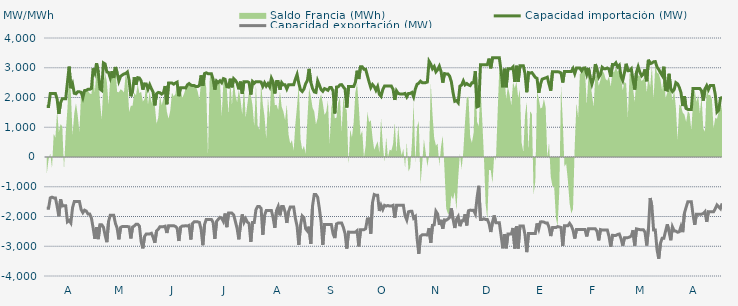
| Category | Capacidad importación (MW) | Capacidad exportación (MW) |
|---|---|---|
| 0 | 1700 | -1725 |
| 1900-01-01 | 1700 | -1725 |
| 1900-01-02 | 2133.333 | -1375 |
| 1900-01-03 | 2133.333 | -1350 |
| 1900-01-04 | 2133.333 | -1375 |
| 1900-01-05 | 2133.333 | -1375 |
| 1900-01-06 | 1943.75 | -1662.5 |
| 1900-01-07 | 1447.917 | -1991.667 |
| 1900-01-08 | 1820.833 | -1420.833 |
| 1900-01-09 | 1958.333 | -1645.833 |
| 1900-01-10 | 1958.333 | -1637.5 |
| 1900-01-11 | 1958.333 | -1637.5 |
| 1900-01-12 | 2502.083 | -2177.083 |
| 1900-01-13 | 3037.5 | -2129.167 |
| 1900-01-14 | 2312.5 | -2216.667 |
| 1900-01-15 | 2456.25 | -1702.083 |
| 1900-01-16 | 2141.667 | -1497.917 |
| 1900-01-17 | 2125 | -1497.917 |
| 1900-01-18 | 2191.667 | -1497.917 |
| 1900-01-19 | 2191.667 | -1497.917 |
| 1900-01-20 | 2175 | -1766.667 |
| 1900-01-21 | 1997.917 | -1870.833 |
| 1900-01-22 | 2233.333 | -1787.5 |
| 1900-01-23 | 2241.667 | -1818.75 |
| 1900-01-24 | 2275 | -1914.583 |
| 1900-01-25 | 2275 | -1914.583 |
| 1900-01-26 | 2304.167 | -2052.083 |
| 1900-01-27 | 2979.167 | -2385.417 |
| 1900-01-28 | 2825 | -2752.083 |
| 1900-01-29 | 3154.167 | -2358.333 |
| 1900-01-30 | 2850 | -2760.417 |
| 1900-01-31 | 2285.417 | -2275 |
| 1900-02-01 | 2239.583 | -2275 |
| 1900-02-02 | 3162.5 | -2358.333 |
| 1900-02-03 | 3127.083 | -2631.25 |
| 1900-02-04 | 2858.333 | -2862.5 |
| 1900-02-05 | 2841.667 | -2166.667 |
| 1900-02-06 | 2656.25 | -1956.25 |
| 1900-02-07 | 2883.333 | -1956.25 |
| 1900-02-08 | 2656.25 | -1956.25 |
| 1900-02-09 | 3025 | -2229.167 |
| 1900-02-10 | 2831.25 | -2393.75 |
| 1900-02-11 | 2550.625 | -2766.667 |
| 1900-02-12 | 2710.417 | -2368.75 |
| 1900-02-13 | 2754.167 | -2337.5 |
| 1900-02-14 | 2791.667 | -2337.5 |
| 1900-02-15 | 2808.333 | -2337.5 |
| 1900-02-16 | 2858.333 | -2337.5 |
| 1900-02-17 | 2581.25 | -2347.917 |
| 1900-02-18 | 2041.667 | -2737.5 |
| 1900-02-19 | 2218.75 | -2354.167 |
| 1900-02-20 | 2679.167 | -2320.833 |
| 1900-02-21 | 2427.083 | -2260.417 |
| 1900-02-22 | 2666.667 | -2260.417 |
| 1900-02-23 | 2654.167 | -2320.833 |
| 1900-02-24 | 2562.5 | -2837.5 |
| 1900-02-25 | 2264.583 | -3070.833 |
| 1900-02-26 | 2458.333 | -2672.917 |
| 1900-02-27 | 2454.167 | -2585.417 |
| 1900-02-28 | 2279.167 | -2585.417 |
| 1900-02-28 | 2431.25 | -2585.417 |
| 1900-03-01 | 2295.833 | -2562.5 |
| 1900-03-02 | 2181.25 | -2700 |
| 1900-03-03 | 1735.417 | -2883.333 |
| 1900-03-04 | 2125 | -2487.5 |
| 1900-03-05 | 2170.833 | -2429.167 |
| 1900-03-06 | 2158.333 | -2341.667 |
| 1900-03-07 | 2112.5 | -2341.667 |
| 1900-03-08 | 2158.333 | -2341.667 |
| 1900-03-09 | 2383.333 | -2325 |
| 1900-03-10 | 1772.917 | -2554.167 |
| 1900-03-11 | 2485.417 | -2308.333 |
| 1900-03-12 | 2485.417 | -2308.333 |
| 1900-03-13 | 2485.417 | -2308.333 |
| 1900-03-14 | 2447.917 | -2308.333 |
| 1900-03-15 | 2485.417 | -2333.333 |
| 1900-03-16 | 2516.667 | -2387.5 |
| 1900-03-17 | 2043.75 | -2822.917 |
| 1900-03-18 | 2331.25 | -2362.5 |
| 1900-03-19 | 2331.25 | -2320.833 |
| 1900-03-20 | 2331.25 | -2320.833 |
| 1900-03-21 | 2318.75 | -2308.333 |
| 1900-03-22 | 2425 | -2320.833 |
| 1900-03-23 | 2468.75 | -2295.833 |
| 1900-03-24 | 2418.75 | -2772.917 |
| 1900-03-25 | 2400 | -2235.417 |
| 1900-03-26 | 2400 | -2179.167 |
| 1900-03-27 | 2366.667 | -2179.167 |
| 1900-03-28 | 2366.667 | -2179.167 |
| 1900-03-29 | 2404.167 | -2200 |
| 1900-03-30 | 2743.75 | -2437.5 |
| 1900-03-31 | 2393.75 | -2964.583 |
| 1900-04-01 | 2804.167 | -2270.833 |
| 1900-04-02 | 2829.167 | -2097.917 |
| 1900-04-03 | 2800 | -2097.917 |
| 1900-04-04 | 2800 | -2097.917 |
| 1900-04-05 | 2800 | -2097.917 |
| 1900-04-06 | 2610.417 | -2200 |
| 1900-04-07 | 2264.583 | -2750 |
| 1900-04-08 | 2556.25 | -2166.667 |
| 1900-04-09 | 2506.25 | -2095.833 |
| 1900-04-10 | 2564.583 | -2029.167 |
| 1900-04-11 | 2497.917 | -2058.333 |
| 1900-04-12 | 2635.417 | -2166.667 |
| 1900-04-13 | 2612.5 | -1900 |
| 1900-04-14 | 2362.5 | -2358.333 |
| 1900-04-15 | 2350 | -1885.417 |
| 1900-04-16 | 2633.333 | -1885.417 |
| 1900-04-17 | 2341.667 | -1885.417 |
| 1900-04-18 | 2633.333 | -1943.75 |
| 1900-04-19 | 2579.167 | -2168.75 |
| 1900-04-20 | 2485.417 | -2400 |
| 1900-04-21 | 2275 | -2766.667 |
| 1900-04-22 | 2533.333 | -2252.083 |
| 1900-04-23 | 2125 | -1929.167 |
| 1900-04-24 | 2533.333 | -2195.833 |
| 1900-04-25 | 2533.333 | -2072.917 |
| 1900-04-26 | 2533.333 | -2187.5 |
| 1900-04-27 | 2500 | -2237.5 |
| 1900-04-28 | 2100 | -2856.25 |
| 1900-04-29 | 2533.333 | -2202.083 |
| 1900-04-30 | 2475 | -2202.083 |
| 1900-05-01 | 2533.333 | -1768.75 |
| 1900-05-02 | 2533.333 | -1662.5 |
| 1900-05-03 | 2533.333 | -1662.5 |
| 1900-05-04 | 2518.75 | -1725 |
| 1900-05-05 | 2375 | -2614.583 |
| 1900-05-06 | 2495.833 | -1964.583 |
| 1900-05-07 | 2383.333 | -1800 |
| 1900-05-08 | 2466.667 | -1800 |
| 1900-05-09 | 2358.333 | -1800 |
| 1900-05-10 | 2650 | -1800 |
| 1900-05-11 | 2525 | -2037.5 |
| 1900-05-12 | 2135.417 | -2381.25 |
| 1900-05-13 | 2537.5 | -1800 |
| 1900-05-14 | 2537.5 | -1662.5 |
| 1900-05-15 | 2260.417 | -1960.417 |
| 1900-05-16 | 2500 | -1662.5 |
| 1900-05-17 | 2425 | -1662.5 |
| 1900-05-18 | 2425 | -1843.75 |
| 1900-05-19 | 2287.5 | -2216.667 |
| 1900-05-20 | 2425 | -1843.75 |
| 1900-05-21 | 2425 | -1681.25 |
| 1900-05-22 | 2425 | -1681.25 |
| 1900-05-23 | 2425 | -1681.25 |
| 1900-05-24 | 2616.667 | -2062.5 |
| 1900-05-25 | 2775 | -2329.167 |
| 1900-05-26 | 2475 | -2956.25 |
| 1900-05-27 | 2258.333 | -2293.75 |
| 1900-05-28 | 2200 | -1981.25 |
| 1900-05-29 | 2283.333 | -2043.75 |
| 1900-05-30 | 2466.667 | -2410.417 |
| 1900-05-31 | 2570.833 | -2485.417 |
| 1900-06-01 | 2962.5 | -2341.667 |
| 1900-06-02 | 2512.5 | -2920.833 |
| 1900-06-03 | 2308.333 | -1650 |
| 1900-06-04 | 2187.5 | -1262.5 |
| 1900-06-05 | 2170.833 | -1262.5 |
| 1900-06-06 | 2558.333 | -1352.083 |
| 1900-06-07 | 2416.667 | -1731.25 |
| 1900-06-08 | 2266.667 | -2175 |
| 1900-06-09 | 2208.333 | -2956.25 |
| 1900-06-10 | 2300 | -2268.75 |
| 1900-06-11 | 2275 | -2266.667 |
| 1900-06-12 | 2241.667 | -2266.667 |
| 1900-06-13 | 2333.333 | -2266.667 |
| 1900-06-14 | 2333.333 | -2270.833 |
| 1900-06-15 | 2212.5 | -2581.25 |
| 1900-06-16 | 1464.583 | -2725 |
| 1900-06-17 | 2350 | -2250 |
| 1900-06-18 | 2358.333 | -2218.75 |
| 1900-06-19 | 2425 | -2218.75 |
| 1900-06-20 | 2433.333 | -2218.75 |
| 1900-06-21 | 2354.167 | -2368.75 |
| 1900-06-22 | 2279.167 | -2575 |
| 1900-06-23 | 1662.5 | -3079.167 |
| 1900-06-24 | 2366.667 | -2522.917 |
| 1900-06-25 | 2366.667 | -2527.083 |
| 1900-06-26 | 2366.667 | -2527.083 |
| 1900-06-27 | 2366.667 | -2527.083 |
| 1900-06-28 | 2508.333 | -2527.083 |
| 1900-06-29 | 2900 | -2477.083 |
| 1900-06-30 | 2620.833 | -3004.167 |
| 1900-07-01 | 3033.333 | -2443.75 |
| 1900-07-02 | 3033.333 | -2443.75 |
| 1900-07-03 | 2950 | -2443.75 |
| 1900-07-04 | 2950 | -2410.417 |
| 1900-07-05 | 2735.417 | -2081.25 |
| 1900-07-06 | 2525 | -2075 |
| 1900-07-07 | 2332.667 | -2579.167 |
| 1900-07-08 | 2437.5 | -1537.5 |
| 1900-07-09 | 2366.667 | -1262.5 |
| 1900-07-10 | 2241.667 | -1287.5 |
| 1900-07-11 | 2366.667 | -1287.5 |
| 1900-07-12 | 2108.333 | -1814.583 |
| 1900-07-13 | 2039.583 | -1625 |
| 1900-07-14 | 2264.583 | -1762.5 |
| 1900-07-15 | 2383.333 | -1625 |
| 1900-07-16 | 2383.333 | -1650 |
| 1900-07-17 | 2383.333 | -1629.167 |
| 1900-07-18 | 2383.333 | -1650 |
| 1900-07-19 | 2383.333 | -1650 |
| 1900-07-20 | 2275 | -1625 |
| 1900-07-21 | 1918.75 | -2037.5 |
| 1900-07-22 | 2225 | -1625 |
| 1900-07-23 | 2138.417 | -1625 |
| 1900-07-24 | 2120.833 | -1625 |
| 1900-07-25 | 2120.833 | -1625 |
| 1900-07-26 | 2120.833 | -1625 |
| 1900-07-27 | 2137.5 | -1975 |
| 1900-07-28 | 2020 | -2116 |
| 1900-07-29 | 2137.5 | -1841.667 |
| 1900-07-30 | 2137.5 | -1825 |
| 1900-07-31 | 2170.833 | -1825 |
| 1900-08-01 | 2022.917 | -2054.167 |
| 1900-08-02 | 2287.5 | -2000 |
| 1900-08-03 | 2445.833 | -2731.25 |
| 1900-08-04 | 2481.25 | -3254.167 |
| 1900-08-05 | 2547.917 | -2662.5 |
| 1900-08-06 | 2500 | -2616.667 |
| 1900-08-07 | 2500 | -2616.667 |
| 1900-08-08 | 2500 | -2616.667 |
| 1900-08-09 | 2520.833 | -2620.833 |
| 1900-08-10 | 3218.75 | -2393.75 |
| 1900-08-11 | 3120.833 | -2885.417 |
| 1900-08-12 | 2966.667 | -2295.833 |
| 1900-08-13 | 3041.667 | -2281.25 |
| 1900-08-14 | 2862.5 | -1822.917 |
| 1900-08-15 | 2933.333 | -1914.583 |
| 1900-08-16 | 3050 | -2281.25 |
| 1900-08-17 | 2875 | -2112.5 |
| 1900-08-18 | 2500 | -2410.417 |
| 1900-08-19 | 2804.167 | -2112.5 |
| 1900-08-20 | 2791.667 | -2125 |
| 1900-08-21 | 2791.667 | -2083.333 |
| 1900-08-22 | 2716.667 | -2031.25 |
| 1900-08-23 | 2529.167 | -1727.083 |
| 1900-08-24 | 2162.5 | -2085.417 |
| 1900-08-25 | 1872.917 | -2385.417 |
| 1900-08-26 | 1897.917 | -2095.833 |
| 1900-08-27 | 1825 | -2002.083 |
| 1900-08-28 | 2383.333 | -2325 |
| 1900-08-29 | 2418.75 | -2145.833 |
| 1900-08-30 | 2558.333 | -2145.833 |
| 1900-08-31 | 2425 | -1925 |
| 1900-09-01 | 2470.833 | -2300 |
| 1900-09-02 | 2425 | -1808.333 |
| 1900-09-03 | 2400 | -1785.417 |
| 1900-09-04 | 2495.833 | -1795.833 |
| 1900-09-05 | 2497.917 | -1789.583 |
| 1900-09-06 | 2882.917 | -1912.5 |
| 1900-09-07 | 1685.417 | -1368.75 |
| 1900-09-08 | 1712.5 | -968.75 |
| 1900-09-09 | 3104.167 | -2100 |
| 1900-09-10 | 3104.167 | -2100 |
| 1900-09-11 | 3104.167 | -2075 |
| 1900-09-12 | 3104.167 | -2100 |
| 1900-09-13 | 3104.167 | -2100 |
| 1900-09-14 | 3306.25 | -2237.5 |
| 1900-09-15 | 2981.25 | -2520.833 |
| 1900-09-16 | 3333.333 | -2189.583 |
| 1900-09-17 | 3333.333 | -1964.583 |
| 1900-09-18 | 3333.333 | -2212.5 |
| 1900-09-19 | 3333.333 | -2212.5 |
| 1900-09-20 | 3333.333 | -2212.5 |
| 1900-09-21 | 2904.167 | -2625 |
| 1900-09-22 | 2343.75 | -3068.75 |
| 1900-09-23 | 2966.667 | -2589.583 |
| 1900-09-24 | 2343.75 | -3068.75 |
| 1900-09-25 | 2966.667 | -2589.583 |
| 1900-09-26 | 2966.667 | -2589.583 |
| 1900-09-27 | 2966.667 | -2589.583 |
| 1900-09-28 | 3025 | -2385.417 |
| 1900-09-29 | 2525 | -3075 |
| 1900-09-30 | 3066.667 | -2320.833 |
| 1900-10-01 | 2525 | -3075 |
| 1900-10-02 | 3066.667 | -2320.833 |
| 1900-10-03 | 3066.667 | -2320.833 |
| 1900-10-04 | 3066.667 | -2320.833 |
| 1900-10-05 | 2800 | -2622.917 |
| 1900-10-06 | 2177.083 | -3197.917 |
| 1900-10-07 | 2837.5 | -2568.75 |
| 1900-10-08 | 2820.833 | -2568.75 |
| 1900-10-09 | 2837.5 | -2568.75 |
| 1900-10-10 | 2758.333 | -2568.75 |
| 1900-10-11 | 2675 | -2568.75 |
| 1900-10-12 | 2641.667 | -2233.333 |
| 1900-10-13 | 2156.25 | -2418.75 |
| 1900-10-14 | 2450 | -2181.25 |
| 1900-10-15 | 2616.667 | -2179.167 |
| 1900-10-16 | 2637.5 | -2187.5 |
| 1900-10-17 | 2658.333 | -2216.667 |
| 1900-10-18 | 2683.333 | -2216.667 |
| 1900-10-19 | 2450 | -2362.5 |
| 1900-10-20 | 2231.25 | -2658.333 |
| 1900-10-21 | 2866.667 | -2372.917 |
| 1900-10-22 | 2866.667 | -2372.917 |
| 1900-10-23 | 2866.667 | -2372.917 |
| 1900-10-24 | 2866.667 | -2339.583 |
| 1900-10-25 | 2854.167 | -2352.083 |
| 1900-10-26 | 2825 | -2368.75 |
| 1900-10-27 | 2504.167 | -2991.667 |
| 1900-10-28 | 2875 | -2314.583 |
| 1900-10-29 | 2875 | -2314.583 |
| 1900-10-30 | 2875 | -2314.583 |
| 1900-10-31 | 2875 | -2231.25 |
| 1900-11-01 | 2875 | -2314.583 |
| 1900-11-02 | 2975 | -2462.5 |
| 1900-11-03 | 2802.083 | -2741.667 |
| 1900-11-04 | 2987.5 | -2433.333 |
| 1900-11-05 | 2987.5 | -2433.333 |
| 1900-11-06 | 2987.5 | -2433.333 |
| 1900-11-07 | 2893.75 | -2433.333 |
| 1900-11-08 | 2987.5 | -2433.333 |
| 1900-11-09 | 2995.833 | -2437.5 |
| 1900-11-10 | 2781.25 | -2670.833 |
| 1900-11-11 | 2993.75 | -2412.5 |
| 1900-11-12 | 2679.167 | -2412.5 |
| 1900-11-13 | 2450 | -2412.5 |
| 1900-11-14 | 2645.833 | -2412.5 |
| 1900-11-15 | 3120.833 | -2412.5 |
| 1900-11-16 | 2958.333 | -2495.833 |
| 1900-11-17 | 2681.25 | -2802.083 |
| 1900-11-18 | 2768.75 | -2439.583 |
| 1900-11-19 | 3016.667 | -2456.25 |
| 1900-11-20 | 2966.667 | -2454.167 |
| 1900-11-21 | 2966.667 | -2452.083 |
| 1900-11-22 | 2991.667 | -2454.167 |
| 1900-11-23 | 2952.083 | -2670.833 |
| 1900-11-24 | 2697.917 | -3016.667 |
| 1900-11-25 | 3108.333 | -2631.25 |
| 1900-11-26 | 3100 | -2637.5 |
| 1900-11-27 | 3166.667 | -2637.5 |
| 1900-11-28 | 3025 | -2604.167 |
| 1900-11-29 | 3083.333 | -2589.583 |
| 1900-11-30 | 2708.333 | -2743.75 |
| 1900-12-01 | 2570.833 | -2979.167 |
| 1900-12-02 | 2833.333 | -2716.667 |
| 1900-12-03 | 3133.333 | -2716.667 |
| 1900-12-04 | 2900 | -2710.417 |
| 1900-12-05 | 2904.167 | -2689.583 |
| 1900-12-06 | 2966.667 | -2654.167 |
| 1900-12-07 | 2587.5 | -2462.5 |
| 1900-12-08 | 2266.667 | -2977.083 |
| 1900-12-09 | 2845.833 | -2416.667 |
| 1900-12-10 | 3033.333 | -2429.167 |
| 1900-12-11 | 2845.833 | -2441.667 |
| 1900-12-12 | 2725 | -2441.667 |
| 1900-12-13 | 2783.333 | -2441.667 |
| 1900-12-14 | 2943.75 | -2529.167 |
| 1900-12-15 | 2545.833 | -2975 |
| 1900-12-16 | 3266.667 | -2410.417 |
| 1900-12-17 | 3137.5 | -1379.167 |
| 1900-12-18 | 3158.333 | -1654.167 |
| 1900-12-19 | 3200 | -2454.167 |
| 1900-12-20 | 3208.333 | -2456.25 |
| 1900-12-21 | 3025 | -3112.5 |
| 1900-12-22 | 2943.75 | -3418.75 |
| 1900-12-23 | 2835.417 | -2900 |
| 1900-12-24 | 2741.667 | -2729.167 |
| 1900-12-25 | 3033.333 | -2729.167 |
| 1900-12-26 | 2262.5 | -2487.5 |
| 1900-12-27 | 2245.833 | -2262.5 |
| 1900-12-28 | 2797.917 | -2500 |
| 1900-12-29 | 2295.652 | -2797.826 |
| 1900-12-30 | 2200 | -2350 |
| 1900-12-31 | 2262.5 | -2481.25 |
| 1901-01-01 | 2500 | -2491.667 |
| 1901-01-02 | 2458.333 | -2529.167 |
| 1901-01-03 | 2341.667 | -2512.5 |
| 1901-01-04 | 2162.5 | -2331.25 |
| 1901-01-05 | 1712.5 | -2525 |
| 1901-01-06 | 2043.75 | -1885.417 |
| 1901-01-07 | 1629.167 | -1687.5 |
| 1901-01-08 | 1600 | -1500 |
| 1901-01-09 | 1600 | -1500 |
| 1901-01-10 | 1600 | -1500 |
| 1901-01-11 | 2300 | -1937.5 |
| 1901-01-12 | 2300 | -2281.25 |
| 1901-01-13 | 2300 | -1920.833 |
| 1901-01-14 | 2300 | -1920.833 |
| 1901-01-15 | 2300 | -1920.833 |
| 1901-01-16 | 2225 | -1920.833 |
| 1901-01-17 | 1896.083 | -1898.167 |
| 1901-01-18 | 2287.5 | -1837.5 |
| 1901-01-19 | 2400 | -2181.25 |
| 1901-01-20 | 2266.667 | -1837.5 |
| 1901-01-21 | 2400 | -1841.667 |
| 1901-01-22 | 2400 | -1841.667 |
| 1901-01-23 | 2400 | -1841.667 |
| 1901-01-24 | 2100 | -1737.5 |
| 1901-01-25 | 1512.5 | -1612.5 |
| 1901-01-26 | 1575 | -1675 |
| 1901-01-27 | 1975 | -1737.5 |
| 1901-01-28 | 2008.333 | -1560.417 |